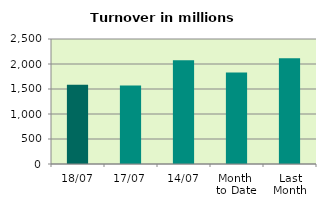
| Category | Series 0 |
|---|---|
| 18/07 | 1583.14 |
| 17/07 | 1569.04 |
| 14/07 | 2076.445 |
| Month 
to Date | 1828.301 |
| Last
Month | 2115.436 |